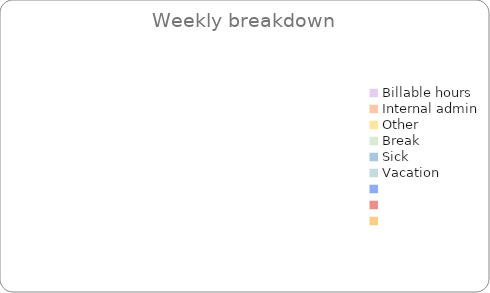
| Category | Total hours |
|---|---|
| Billable hours | 0 |
| Internal admin | 0 |
| Other | 0 |
| Break | 0 |
| Sick | 0 |
| Vacation | 0 |